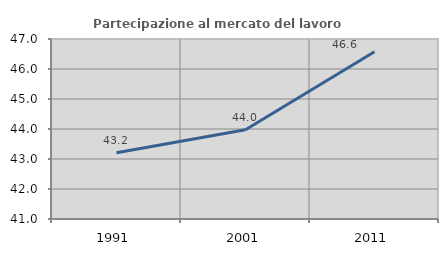
| Category | Partecipazione al mercato del lavoro  femminile |
|---|---|
| 1991.0 | 43.207 |
| 2001.0 | 43.976 |
| 2011.0 | 46.572 |